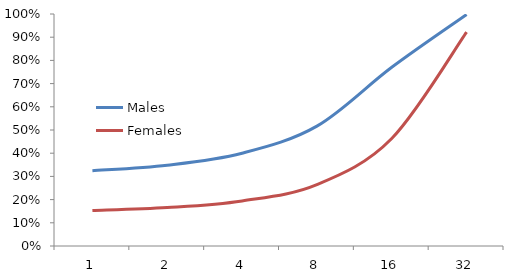
| Category | Males | Females |
|---|---|---|
| 1.0 | 0.324 | 0.153 |
| 2.0 | 0.348 | 0.166 |
| 4.0 | 0.4 | 0.194 |
| 8.0 | 0.516 | 0.265 |
| 16.0 | 0.77 | 0.463 |
| 32.0 | 0.998 | 0.922 |